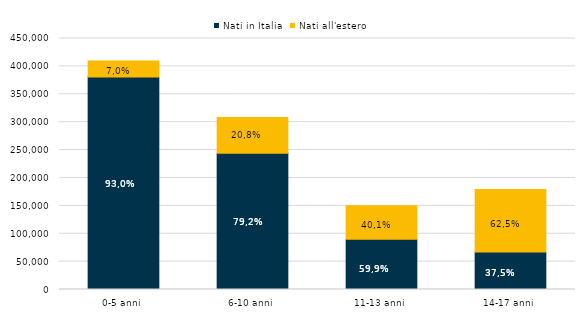
| Category | Nati in Italia | Nati all'estero |
|---|---|---|
| 0-5 anni | 380875 | 28819 |
| 6-10 anni | 244260 | 64120 |
| 11-13 anni | 89922 | 60278 |
| 14-17 anni | 67228 | 111869 |